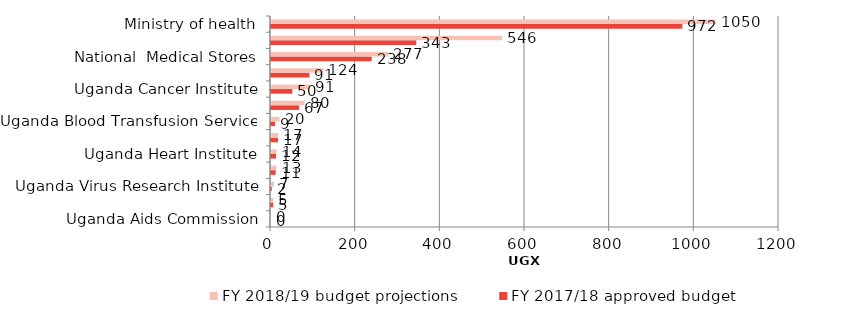
| Category | FY 2017/18 approved budget | FY 2018/19 budget projections |
|---|---|---|
| Uganda Aids Commission | 0 | 0 |
| Health Service Commission | 5.42 | 5.2 |
| Uganda Virus Research Institute | 1.83 | 7.12 |
| Butabika hospital | 11.02 | 13.05 |
| Uganda Heart Institute | 12.01 | 13.5 |
| KCCA health grant | 16.6 | 17.19 |
| Uganda Blood Transfusion Service | 9.44 | 20.17 |
| Mulago hospital complex | 66.51 | 79.51 |
| Uganda Cancer Institute | 50.34 | 91.19 |
| Regional referral hospitals | 90.73 | 123.87 |
| National  Medical Stores | 237.96 | 276.96 |
| Local government health | 343.23 | 545.64 |
| Ministry of health | 971.74 | 1050.29 |